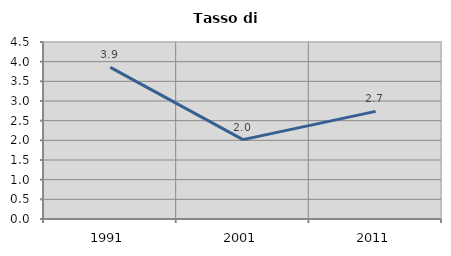
| Category | Tasso di disoccupazione   |
|---|---|
| 1991.0 | 3.855 |
| 2001.0 | 2.018 |
| 2011.0 | 2.737 |